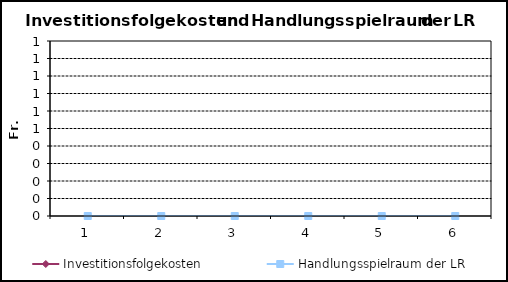
| Category | Investitionsfolgekosten | Handlungsspielraum der LR |
|---|---|---|
| 1.0 | 0 | 0 |
| 2.0 | 0 | 0 |
| 3.0 | 0 | 0 |
| 4.0 | 0 | 0 |
| 5.0 | 0 | 0 |
| 6.0 | 0 | 0 |